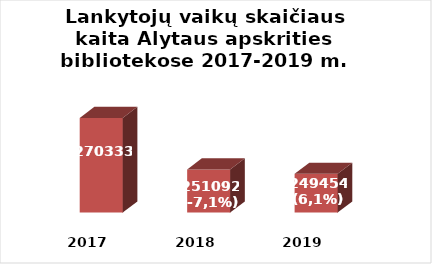
| Category | Series 0 |
|---|---|
| 2017.0 | 270333 |
| 2018.0 | 251092 |
| 2019.0 | 249454 |